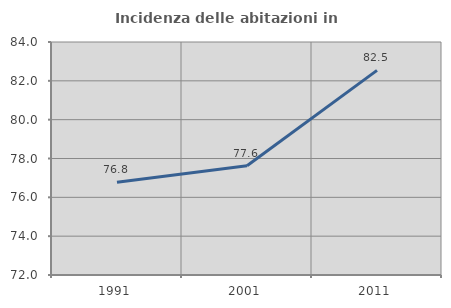
| Category | Incidenza delle abitazioni in proprietà  |
|---|---|
| 1991.0 | 76.775 |
| 2001.0 | 77.625 |
| 2011.0 | 82.54 |